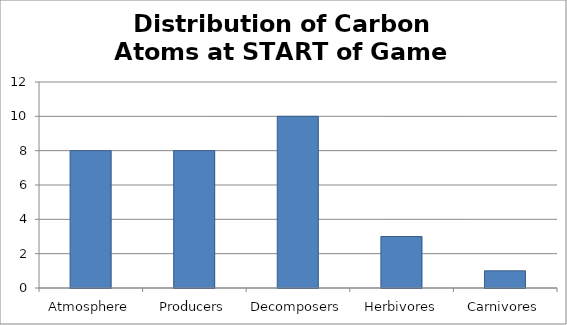
| Category | Series 0 |
|---|---|
| Atmosphere | 8 |
| Producers | 8 |
| Decomposers | 10 |
| Herbivores | 3 |
| Carnivores | 1 |